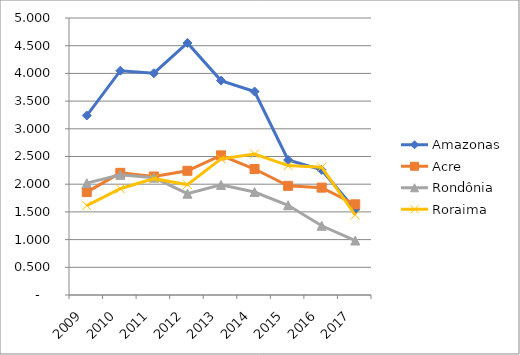
| Category | Amazonas | Acre | Rondônia | Roraima |
|---|---|---|---|---|
| 2009.0 | 3.24 | 1.857 | 2.02 | 1.613 |
| 2010.0 | 4.049 | 2.205 | 2.168 | 1.918 |
| 2011.0 | 4.003 | 2.139 | 2.118 | 2.1 |
| 2012.0 | 4.55 | 2.242 | 1.828 | 1.992 |
| 2013.0 | 3.87 | 2.52 | 1.987 | 2.458 |
| 2014.0 | 3.673 | 2.274 | 1.859 | 2.543 |
| 2015.0 | 2.438 | 1.97 | 1.62 | 2.335 |
| 2016.0 | 2.258 | 1.938 | 1.25 | 2.308 |
| 2017.0 | 1.539 | 1.637 | 0.983 | 1.444 |